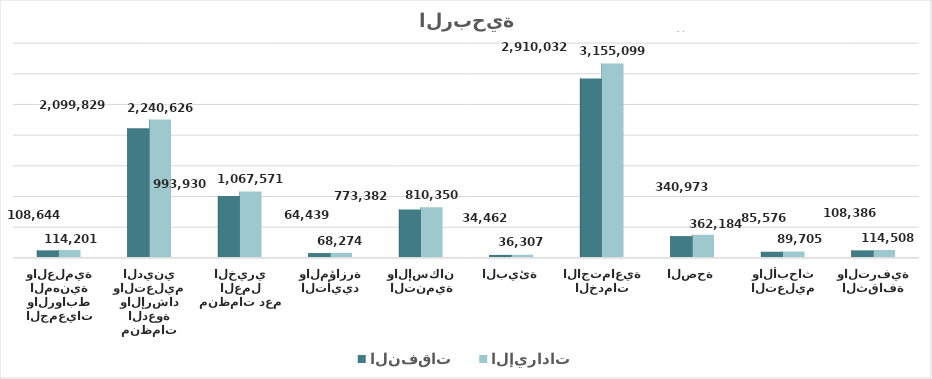
| Category | النفقات | الإيرادات |
|---|---|---|
| الثقافة والترفية | 108386.326 | 114507.907 |
| التعليم والأبحاث | 85576.402 | 89704.822 |
| الصحة | 340972.985 | 362184.382 |
| الخدمات الاجتماعية | 2910032.396 | 3155099.152 |
| البيئة | 34461.904 | 36307.373 |
| التنمية والإسكان | 773381.628 | 810349.808 |
| التأييد والمؤازرة | 64438.961 | 68273.755 |
| منظمات دعم العمل الخيري | 993930.331 | 1067571.236 |
| منظمات الدعوة والإرشاد والتعليم الديني | 2099828.554 | 2240625.902 |
| الجمعيات والروابط المهنية والعلمية | 108644.054 | 114200.938 |